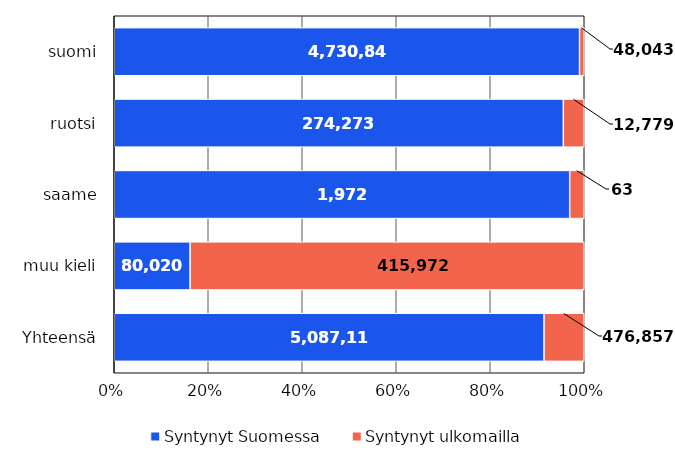
| Category | Syntynyt Suomessa | Syntynyt ulkomailla |
|---|---|---|
| suomi | 4730848 | 48043 |
| ruotsi | 274273 | 12779 |
| saame | 1972 | 63 |
| muu kieli | 80020 | 415972 |
| Yhteensä | 5087113 | 476857 |